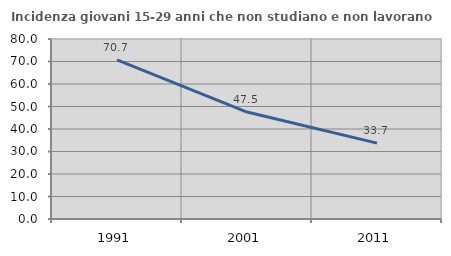
| Category | Incidenza giovani 15-29 anni che non studiano e non lavorano  |
|---|---|
| 1991.0 | 70.717 |
| 2001.0 | 47.541 |
| 2011.0 | 33.725 |